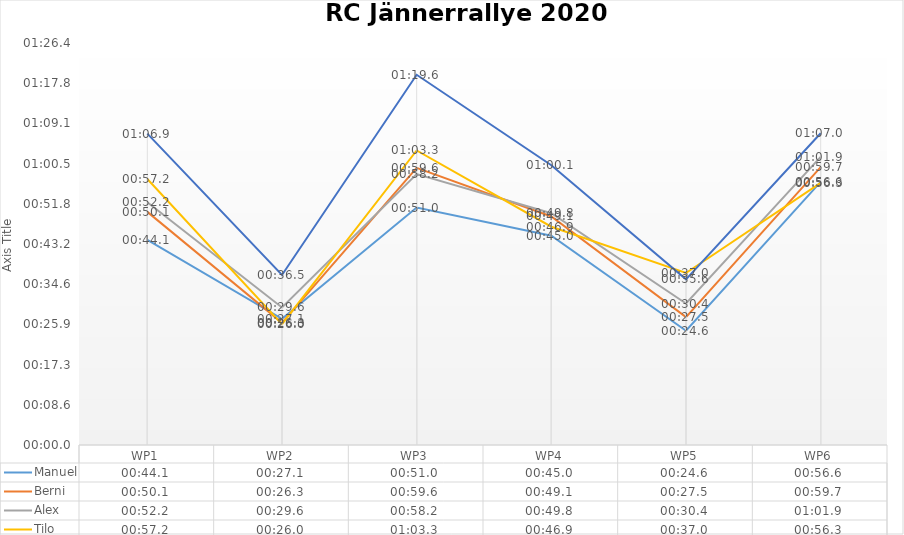
| Category | Manuel | Berni | Alex | Tilo | Rolf |
|---|---|---|---|---|---|
| WP1 | 0.001 | 0.001 | 0.001 | 0.001 | 0.001 |
| WP2 | 0 | 0 | 0 | 0 | 0 |
| WP3 | 0.001 | 0.001 | 0.001 | 0.001 | 0.001 |
| WP4 | 0.001 | 0.001 | 0.001 | 0.001 | 0.001 |
| WP5 | 0 | 0 | 0 | 0 | 0 |
| WP6 | 0.001 | 0.001 | 0.001 | 0.001 | 0.001 |